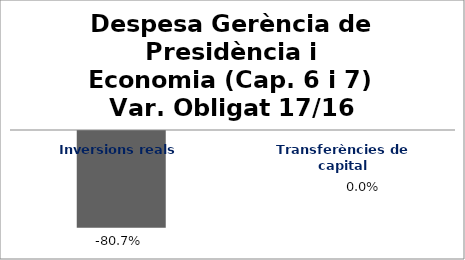
| Category | Series 0 |
|---|---|
| Inversions reals | -0.807 |
| Transferències de capital | 0 |